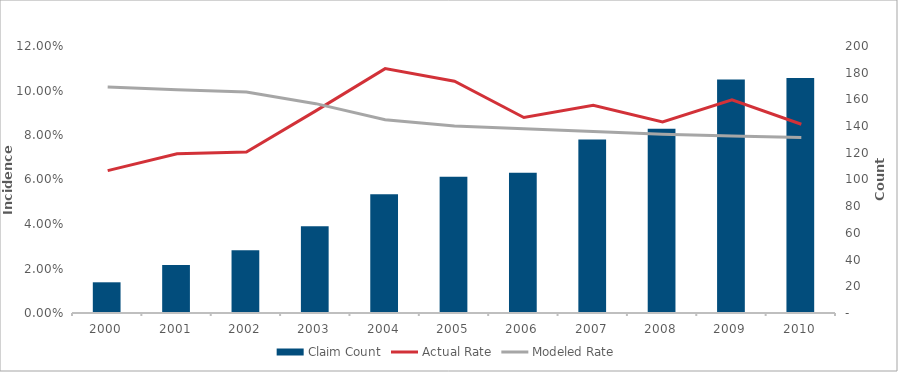
| Category | Claim Count |
|---|---|
| 2000.0 | 23 |
| 2001.0 | 36 |
| 2002.0 | 47 |
| 2003.0 | 65 |
| 2004.0 | 89 |
| 2005.0 | 102 |
| 2006.0 | 105 |
| 2007.0 | 130 |
| 2008.0 | 138 |
| 2009.0 | 175 |
| 2010.0 | 176 |